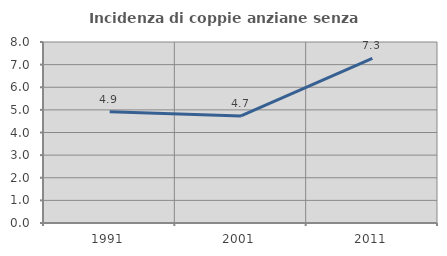
| Category | Incidenza di coppie anziane senza figli  |
|---|---|
| 1991.0 | 4.914 |
| 2001.0 | 4.733 |
| 2011.0 | 7.281 |